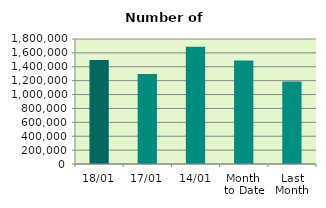
| Category | Series 0 |
|---|---|
| 18/01 | 1497888 |
| 17/01 | 1294788 |
| 14/01 | 1688442 |
| Month 
to Date | 1490715.667 |
| Last
Month | 1187425.652 |